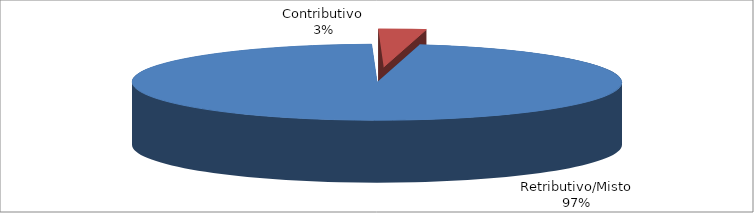
| Category | Series 1 |
|---|---|
| Retributivo/Misto | 160738 |
| Contributivo | 5200 |